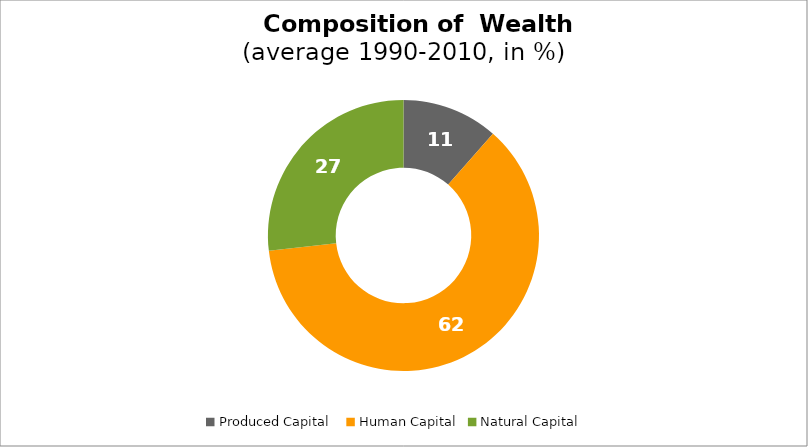
| Category | Series 0 |
|---|---|
| Produced Capital  | 11.471 |
| Human Capital | 61.727 |
| Natural Capital | 26.802 |